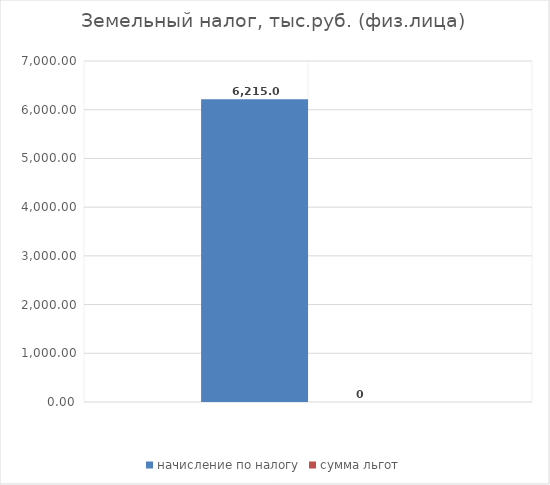
| Category | начисление по налогу | сумма льгот |
|---|---|---|
| 0 | 6215 | 0 |